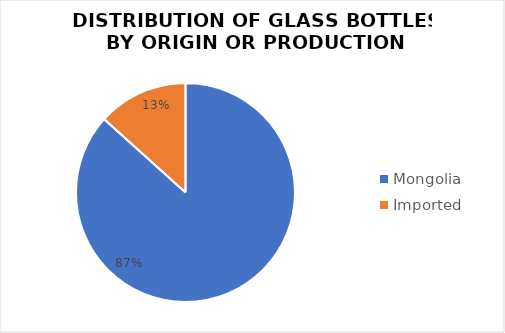
| Category | Series 0 |
|---|---|
| Mongolia | 1202.22 |
| Imported | 184.779 |